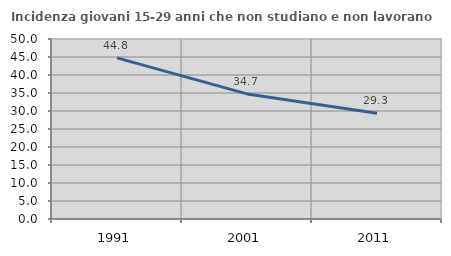
| Category | Incidenza giovani 15-29 anni che non studiano e non lavorano  |
|---|---|
| 1991.0 | 44.768 |
| 2001.0 | 34.748 |
| 2011.0 | 29.348 |